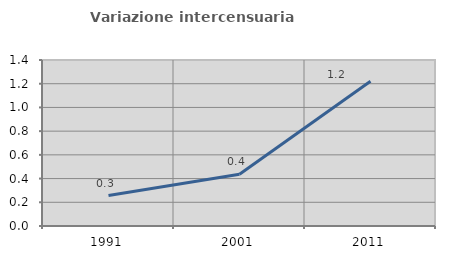
| Category | Variazione intercensuaria annua |
|---|---|
| 1991.0 | 0.256 |
| 2001.0 | 0.436 |
| 2011.0 | 1.22 |